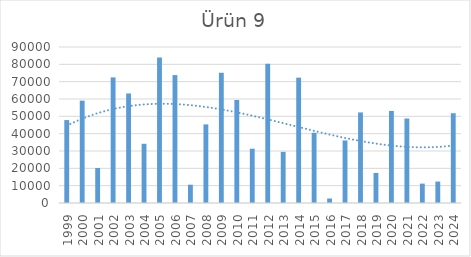
| Category | Ürün 9 |
|---|---|
| 1999.0 | 47847 |
| 2000.0 | 59059 |
| 2001.0 | 20188 |
| 2002.0 | 72467 |
| 2003.0 | 63193 |
| 2004.0 | 34167 |
| 2005.0 | 83944 |
| 2006.0 | 73798 |
| 2007.0 | 10561 |
| 2008.0 | 45365 |
| 2009.0 | 75173 |
| 2010.0 | 59446 |
| 2011.0 | 31327 |
| 2012.0 | 80341 |
| 2013.0 | 29515 |
| 2014.0 | 72316 |
| 2015.0 | 40525 |
| 2016.0 | 2597 |
| 2017.0 | 36087 |
| 2018.0 | 52258 |
| 2019.0 | 17335 |
| 2020.0 | 53117 |
| 2021.0 | 48744 |
| 2022.0 | 11173 |
| 2023.0 | 12372 |
| 2024.0 | 51799 |